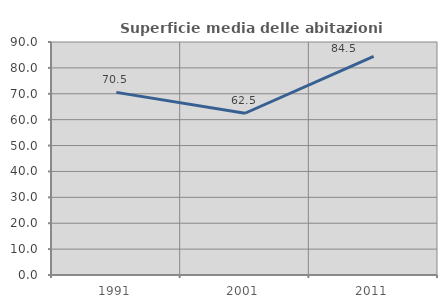
| Category | Superficie media delle abitazioni occupate |
|---|---|
| 1991.0 | 70.549 |
| 2001.0 | 62.478 |
| 2011.0 | 84.469 |